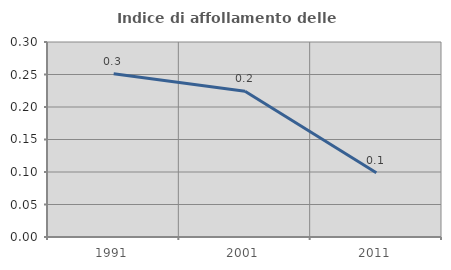
| Category | Indice di affollamento delle abitazioni  |
|---|---|
| 1991.0 | 0.251 |
| 2001.0 | 0.224 |
| 2011.0 | 0.099 |